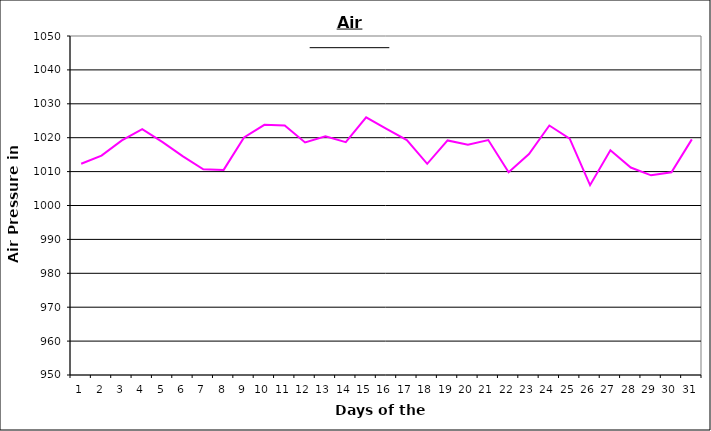
| Category | Series 0 |
|---|---|
| 0 | 1012.3 |
| 1 | 1014.7 |
| 2 | 1019.2 |
| 3 | 1022.5 |
| 4 | 1018.7 |
| 5 | 1014.5 |
| 6 | 1010.7 |
| 7 | 1010.5 |
| 8 | 1020.1 |
| 9 | 1023.8 |
| 10 | 1023.6 |
| 11 | 1018.6 |
| 12 | 1020.4 |
| 13 | 1018.7 |
| 14 | 1026 |
| 15 | 1022.6 |
| 16 | 1019.3 |
| 17 | 1012.3 |
| 18 | 1019.2 |
| 19 | 1017.9 |
| 20 | 1019.3 |
| 21 | 1009.8 |
| 22 | 1015.2 |
| 23 | 1023.6 |
| 24 | 1019.7 |
| 25 | 1006 |
| 26 | 1016.3 |
| 27 | 1011.2 |
| 28 | 1008.9 |
| 29 | 1009.8 |
| 30 | 1019.5 |